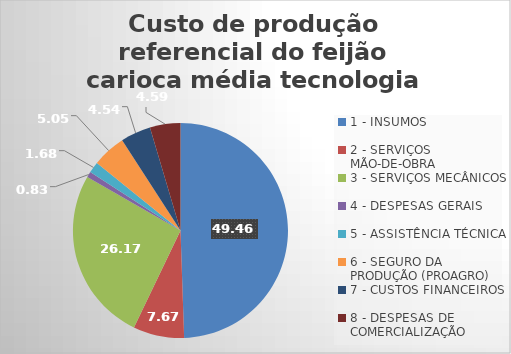
| Category | Series 0 |
|---|---|
| 1 - INSUMOS | 49.462 |
| 2 - SERVIÇOS MÃO-DE-OBRA | 7.667 |
| 3 - SERVIÇOS MECÂNICOS | 26.175 |
| 4 - DESPESAS GERAIS  | 0.833 |
| 5 - ASSISTÊNCIA TÉCNICA | 1.683 |
| 6 - SEGURO DA PRODUÇÃO (PROAGRO) | 5.048 |
| 7 - CUSTOS FINANCEIROS | 4.543 |
| 8 - DESPESAS DE COMERCIALIZAÇÃO | 4.588 |